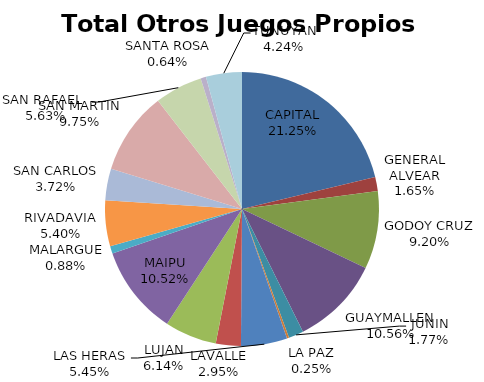
| Category | Total Otros Juegos Propios Beneficio |
|---|---|
| CAPITAL | 247669.78 |
| GENERAL ALVEAR | 19237.52 |
| GODOY CRUZ | 107231.55 |
| GUAYMALLEN | 123102.55 |
| JUNIN | 20567.92 |
| LA PAZ | 2891.21 |
| LAS HERAS | 63517.82 |
| LAVALLE | 34428.02 |
| LUJAN | 71605.1 |
| MAIPU | 122631.85 |
| MALARGUE | 10240.77 |
| RIVADAVIA | 62965.21 |
| SAN CARLOS | 43388.12 |
| SAN MARTIN | 113614.79 |
| SAN RAFAEL  | 65633.54 |
| SANTA ROSA | 7430.2 |
| TUNUYAN | 49423.1 |